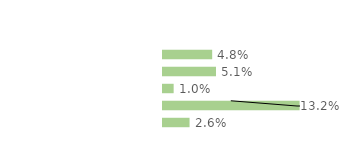
| Category | Series 0 |
|---|---|
| Personnes en emploi¹ | 0.048 |
| Chômeuses | 0.051 |
| Retraitées | 0.01 |
| Étudiantes, élèves | 0.132 |
| Autres inactifs  | 0.026 |